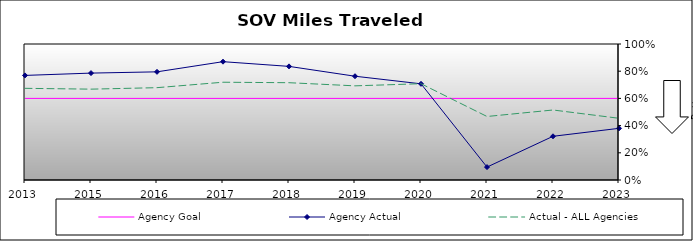
| Category | Agency Goal | Agency Actual | Actual - ALL Agencies |
|---|---|---|---|
| 2013.0 | 0.6 | 0.769 | 0.674 |
| 2015.0 | 0.6 | 0.786 | 0.668 |
| 2016.0 | 0.6 | 0.795 | 0.679 |
| 2017.0 | 0.6 | 0.87 | 0.719 |
| 2018.0 | 0.6 | 0.835 | 0.715 |
| 2019.0 | 0.6 | 0.763 | 0.692 |
| 2020.0 | 0.6 | 0.707 | 0.708 |
| 2021.0 | 0.6 | 0.095 | 0.467 |
| 2022.0 | 0.6 | 0.321 | 0.515 |
| 2023.0 | 0.6 | 0.38 | 0.454 |